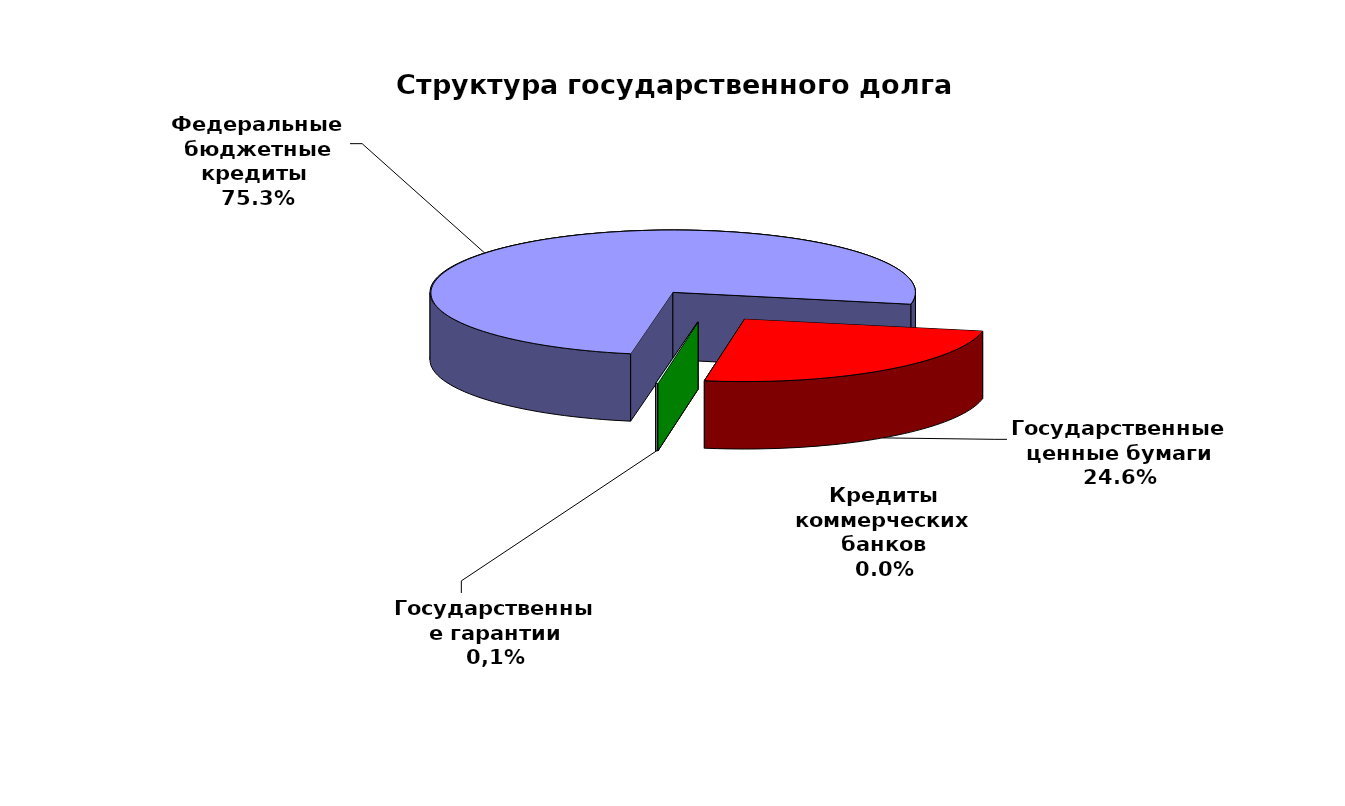
| Category | Series 0 |
|---|---|
| Федеральные бюджетные кредиты  | 104096716.081 |
| Государственные ценные бумаги | 34000000 |
| Кредиты коммерческих банков | 0 |
| Государственные гарантии | 190641.019 |